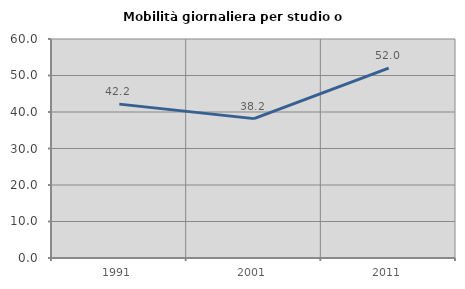
| Category | Mobilità giornaliera per studio o lavoro |
|---|---|
| 1991.0 | 42.157 |
| 2001.0 | 38.185 |
| 2011.0 | 52.034 |